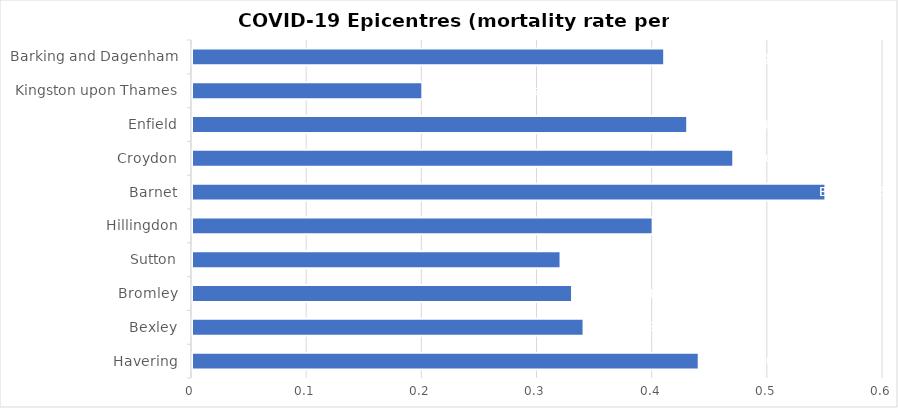
| Category | 0.44 |
|---|---|
| Havering | 0.44 |
| Bexley | 0.34 |
| Bromley | 0.33 |
| Sutton | 0.32 |
| Hillingdon | 0.4 |
| Barnet | 0.55 |
| Croydon | 0.47 |
| Enfield | 0.43 |
| Kingston upon Thames | 0.2 |
| Barking and Dagenham | 0.41 |